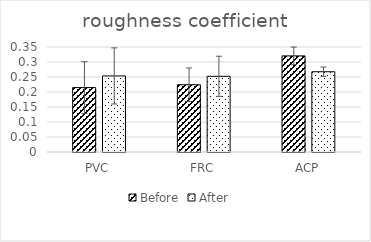
| Category | Before | After |
|---|---|---|
| PVC | 0.215 | 0.254 |
| FRC | 0.224 | 0.252 |
| ACP | 0.32 | 0.268 |